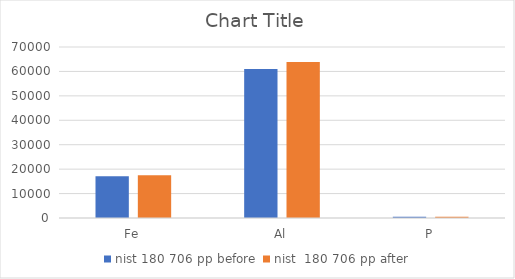
| Category | nist 180 706 pp before | nist  180 706 pp after |
|---|---|---|
| Fe | 17091.26 | 17525.69 |
| Al | 61027.02 | 63854.5 |
| P | 529.22 | 519.04 |